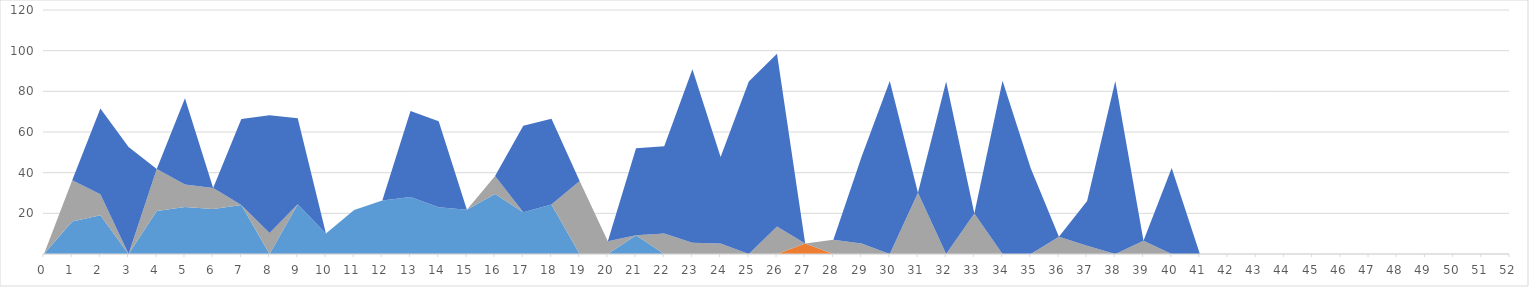
| Category | Series 0 | Series 1 | Series 2 | Series 3 | Series 4 |
|---|---|---|---|---|---|
| 0.0 | 0 | 0 | 0 | 0 | 0 |
| 1.0 | 16.03 | 0 | 20.28 | 0 | 0 |
| 2.0 | 19.1 | 0 | 10.25 | 0 | 42.22 |
| 3.0 | 0 | 0 | 0 | 0 | 52.62 |
| 4.0 | 21.1 | 0 | 20.7 | 0 | 0 |
| 5.0 | 23.15 | 0 | 11.01 | 0 | 42.45 |
| 6.0 | 22.08 | 0 | 10.39 | 0 | 0 |
| 7.0 | 24.12 | 0 | 0 | 0 | 42.33 |
| 8.0 | 0 | 0 | 10.35 | 0 | 57.83 |
| 9.0 | 24.47 | 0 | 0 | 0 | 42.3 |
| 10.0 | 10.05 | 0 | 0 | 0 | 0 |
| 11.0 | 21.66 | 0 | 0 | 0 | 0 |
| 12.0 | 26.26 | 0 | 0 | 0 | 0 |
| 13.0 | 28.01 | 0 | 0 | 0 | 42.27 |
| 14.0 | 23.01 | 0 | 0 | 0 | 42.23 |
| 15.0 | 21.75 | 0 | 0 | 0 | 0 |
| 16.0 | 29.47 | 0 | 8.94 | 0 | 0 |
| 17.0 | 20.56 | 0 | 0 | 0 | 42.54 |
| 18.0 | 24.3 | 0 | 0 | 0 | 42.2 |
| 19.0 | 0 | 0 | 35.86 | 0 | 0 |
| 20.0 | 0 | 0 | 6.3 | 0 | 0 |
| 21.0 | 9.27 | 0 | 0 | 0 | 42.7 |
| 22.0 | 0 | 0 | 10.13 | 0 | 42.83 |
| 23.0 | 0 | 0 | 5.54 | 0 | 85.3 |
| 24.0 | 0 | 0 | 5.19 | 0 | 42.46 |
| 25.0 | 0 | 0 | 0 | 0 | 84.79 |
| 26.0 | 0 | 0 | 13.57 | 0 | 84.87 |
| 27.0 | 0 | 5.16 | 0 | 0 | 0 |
| 28.0 | 0 | 0 | 7.01 | 0 | 0 |
| 29.0 | 0 | 0 | 5.22 | 0 | 42.56 |
| 30.0 | 0 | 0 | 0 | 0 | 85.13 |
| 31.0 | 0 | 0 | 30.13 | 0 | 0 |
| 32.0 | 0 | 0 | 0 | 0 | 84.87 |
| 33.0 | 0 | 0 | 19.92 | 0 | 0 |
| 34.0 | 0 | 0 | 0 | 0 | 85.22 |
| 35.0 | 0 | 0 | 0 | 0 | 42.22 |
| 36.0 | 0 | 0 | 8.46 | 0 | 0 |
| 37.0 | 0 | 0 | 4.08 | 0 | 21.95 |
| 38.0 | 0 | 0 | 0 | 0 | 85.09 |
| 39.0 | 0 | 0 | 6.49 | 0 | 0 |
| 40.0 | 0 | 0 | 0 | 0 | 42.25 |
| 41.0 | 0 | 0 | 0 | 0 | 0 |
| 42.0 | 0 | 0 | 0 | 0 | 0 |
| 43.0 | 0 | 0 | 0 | 0 | 0 |
| 44.0 | 0 | 0 | 0 | 0 | 0 |
| 45.0 | 0 | 0 | 0 | 0 | 0 |
| 46.0 | 0 | 0 | 0 | 0 | 0 |
| 47.0 | 0 | 0 | 0 | 0 | 0 |
| 48.0 | 0 | 0 | 0 | 0 | 0 |
| 49.0 | 0 | 0 | 0 | 0 | 0 |
| 50.0 | 0 | 0 | 0 | 0 | 0 |
| 51.0 | 0 | 0 | 0 | 0 | 0 |
| 52.0 | 0 | 0 | 0 | 0 | 0 |